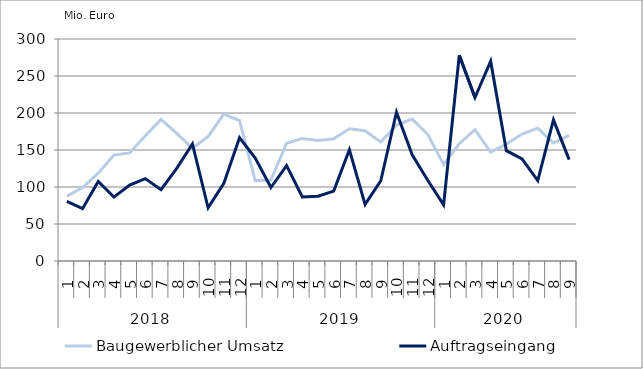
| Category | Baugewerblicher Umsatz | Auftragseingang |
|---|---|---|
| 0 | 87640.529 | 80684.627 |
| 1 | 99259.455 | 70746.763 |
| 2 | 118764.324 | 107538.747 |
| 3 | 143144.178 | 86374.619 |
| 4 | 146070.782 | 102661.329 |
| 5 | 169150.753 | 111287.709 |
| 6 | 191277.885 | 96286.662 |
| 7 | 172425.535 | 125142.495 |
| 8 | 152354.98 | 158112.302 |
| 9 | 168372.756 | 71808.619 |
| 10 | 198558.472 | 104904.147 |
| 11 | 189665.914 | 166653.461 |
| 12 | 108616.605 | 139065.287 |
| 13 | 109331.58 | 99318.609 |
| 14 | 159117.81 | 129002.041 |
| 15 | 165654.287 | 86579.2 |
| 16 | 162976.056 | 87644.362 |
| 17 | 165026.188 | 94463.186 |
| 18 | 178622.938 | 150345.08 |
| 19 | 176074.101 | 76434.317 |
| 20 | 160663.041 | 108444.162 |
| 21 | 183589.485 | 201122.697 |
| 22 | 191777.213 | 143514.792 |
| 23 | 170885.223 | 108780.022 |
| 24 | 130445.562 | 75891.481 |
| 25 | 158433.655 | 277923.85 |
| 26 | 177529.832 | 220973.626 |
| 27 | 147259.799 | 269936.091 |
| 28 | 157965.891 | 149072.895 |
| 29 | 171647.778 | 137984.76 |
| 30 | 179530.732 | 108645.965 |
| 31 | 159480.457 | 190771.468 |
| 32 | 169638.111 | 136988.906 |